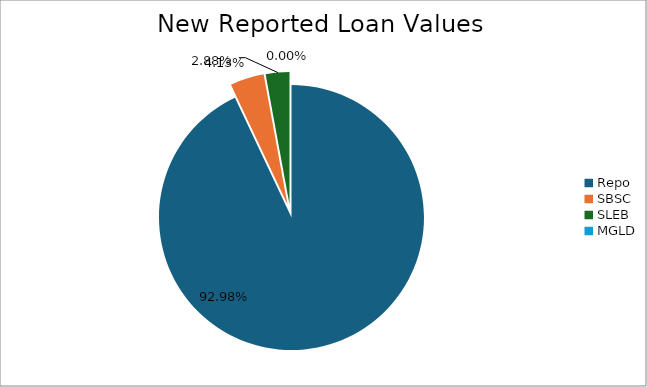
| Category | Series 0 |
|---|---|
| Repo | 13852080.214 |
| SBSC | 615116.752 |
| SLEB | 429732.847 |
| MGLD | 356.908 |